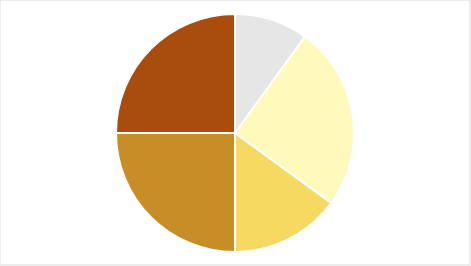
| Category | Series 0 |
|---|---|
| 0 | 0.1 |
| 1 | 0.25 |
| 2 | 0.15 |
| 3 | 0.25 |
| 4 | 0.25 |